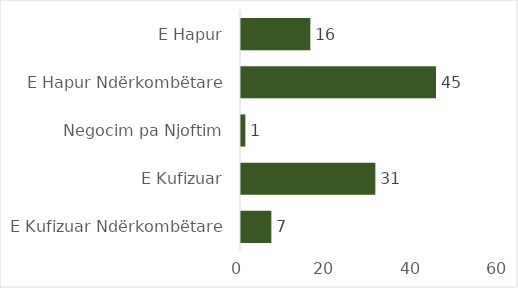
| Category | Nr. Procedurash |
|---|---|
| E Kufizuar Ndërkombëtare | 7 |
| E Kufizuar | 31 |
| Negocim pa Njoftim | 1 |
| E Hapur Ndërkombëtare | 45 |
| E Hapur | 16 |